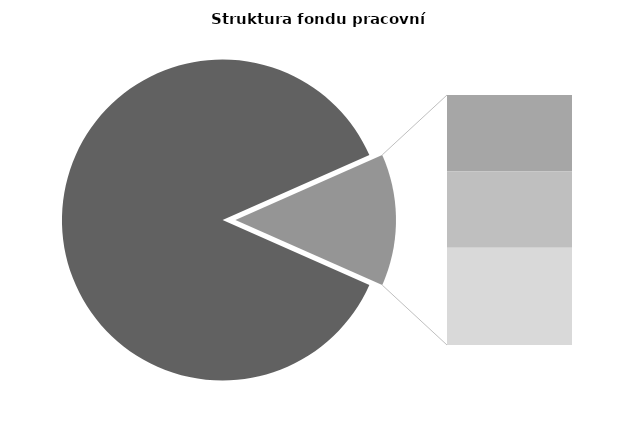
| Category | Series 0 |
|---|---|
| Průměrná měsíční 
odpracovaná doba  
bez přesčasu | 147.751 |
| Dovolená | 6.895 |
| Nemoc | 6.932 |
| Jiné | 8.808 |